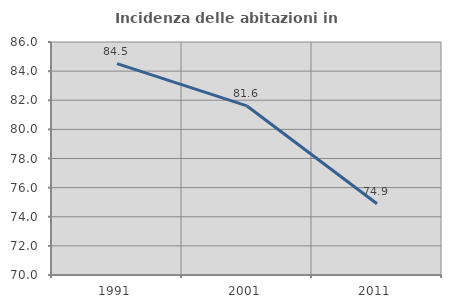
| Category | Incidenza delle abitazioni in proprietà  |
|---|---|
| 1991.0 | 84.519 |
| 2001.0 | 81.609 |
| 2011.0 | 74.894 |